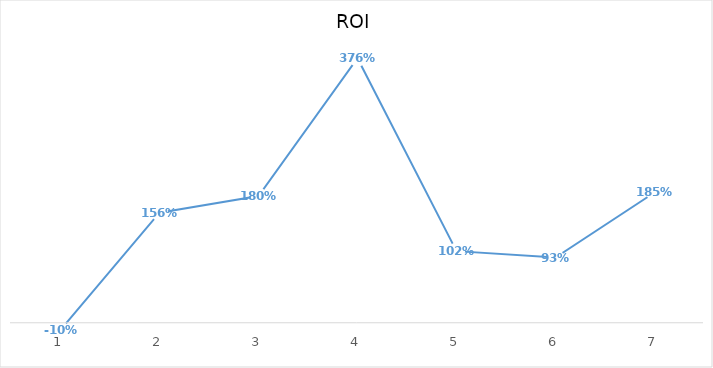
| Category | ROI |
|---|---|
| 0 | -0.1 |
| 1 | 1.562 |
| 2 | 1.799 |
| 3 | 3.755 |
| 4 | 1.017 |
| 5 | 0.926 |
| 6 | 1.85 |